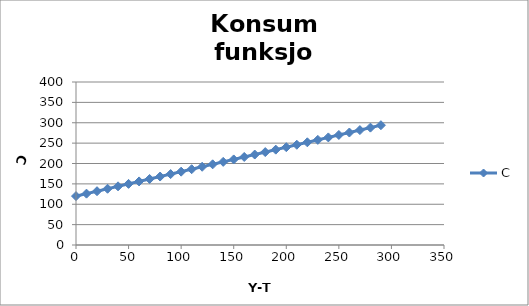
| Category | C |
|---|---|
| 0.0 | 120 |
| 10.0 | 126 |
| 20.0 | 132 |
| 30.0 | 138 |
| 40.0 | 144 |
| 50.0 | 150 |
| 60.0 | 156 |
| 70.0 | 162 |
| 80.0 | 168 |
| 90.0 | 174 |
| 100.0 | 180 |
| 110.0 | 186 |
| 120.0 | 192 |
| 130.0 | 198 |
| 140.0 | 204 |
| 150.0 | 210 |
| 160.0 | 216 |
| 170.0 | 222 |
| 180.0 | 228 |
| 190.0 | 234 |
| 200.0 | 240 |
| 210.0 | 246 |
| 220.0 | 252 |
| 230.0 | 258 |
| 240.0 | 264 |
| 250.0 | 270 |
| 260.0 | 276 |
| 270.0 | 282 |
| 280.0 | 288 |
| 290.0 | 294 |